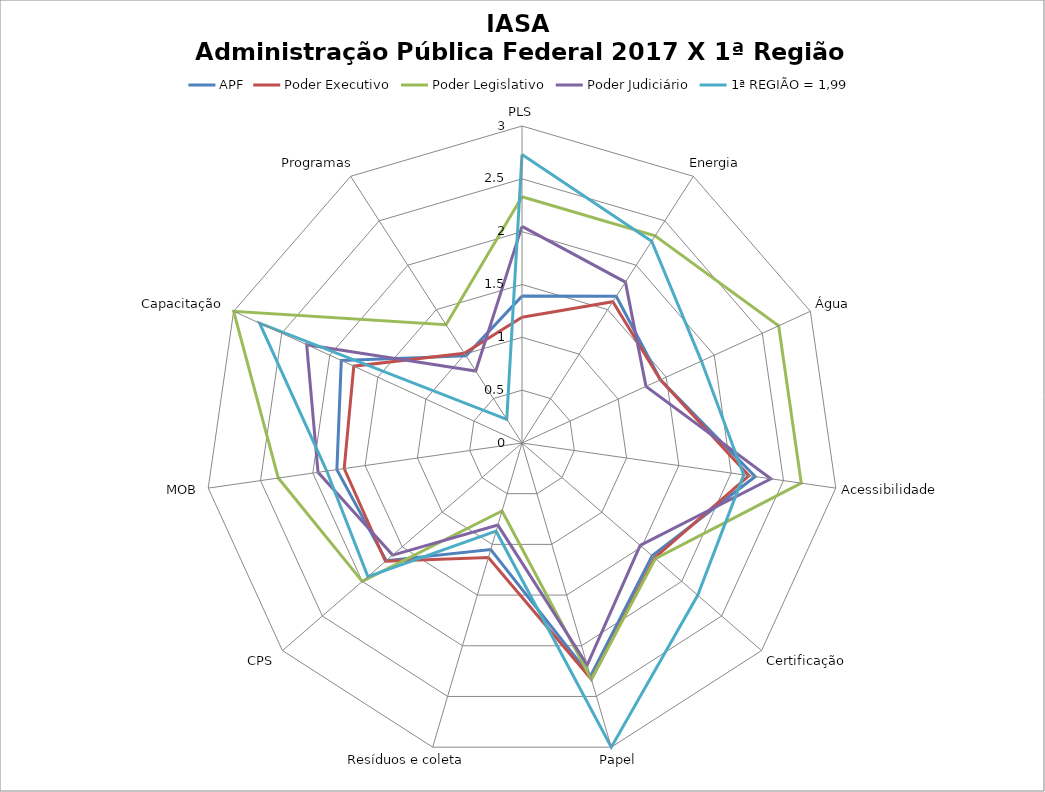
| Category | APF | Poder Executivo | Poder Legislativo | Poder Judiciário | 1ª REGIÃO = 1,99 |
|---|---|---|---|---|---|
| PLS | 1.39 | 1.19 | 2.33 | 2.05 | 2.73 |
| Energia | 1.65 | 1.59 | 2.33 | 1.81 | 2.27 |
| Água | 1.44 | 1.44 | 2.67 | 1.29 | 1.867 |
| Acessibilidade | 2.23 | 2.17 | 2.67 | 2.38 | 2.12 |
| Certificação | 1.63 | 1.66 | 1.67 | 1.48 | 2.2 |
| Papel | 2.3 | 2.33 | 2.33 | 2.19 | 3 |
| Resíduos e coleta | 1.05 | 1.13 | 0.67 | 0.81 | 0.87 |
| CPS | 1.7 | 1.71 | 2 | 1.62 | 1.93 |
| MOB | 1.77 | 1.7 | 2.33 | 1.95 | 1.867 |
| Capacitação | 1.88 | 1.75 | 3 | 2.24 | 2.73 |
| Programas | 0.98 | 1.01 | 1.33 | 0.81 | 0.267 |